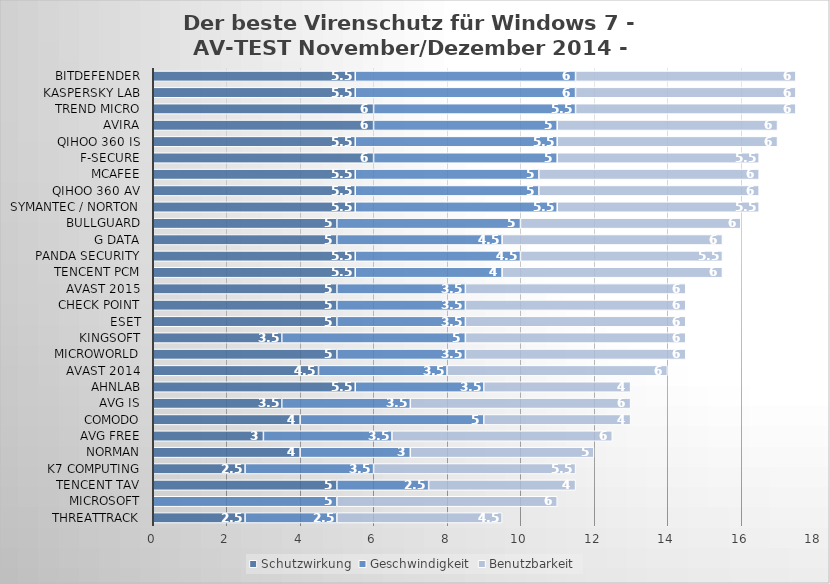
| Category | Schutzwirkung | Geschwindigkeit | Benutzbarkeit |
|---|---|---|---|
| ThreatTrack | 2.5 | 2.5 | 4.5 |
| Microsoft | 0 | 5 | 6 |
| Tencent TAV | 5 | 2.5 | 4 |
| K7 Computing | 2.5 | 3.5 | 5.5 |
| Norman | 4 | 3 | 5 |
| AVG Free | 3 | 3.5 | 6 |
| Comodo | 4 | 5 | 4 |
| AVG IS | 3.5 | 3.5 | 6 |
| AhnLab | 5.5 | 3.5 | 4 |
| Avast 2014 | 4.5 | 3.5 | 6 |
| Microworld | 5 | 3.5 | 6 |
| Kingsoft | 3.5 | 5 | 6 |
| ESET | 5 | 3.5 | 6 |
| Check Point | 5 | 3.5 | 6 |
| Avast 2015 | 5 | 3.5 | 6 |
| Tencent PCM | 5.5 | 4 | 6 |
| Panda Security | 5.5 | 4.5 | 5.5 |
| G Data | 5 | 4.5 | 6 |
| BullGuard | 5 | 5 | 6 |
| Symantec / Norton | 5.5 | 5.5 | 5.5 |
| Qihoo 360 AV | 5.5 | 5 | 6 |
| McAfee | 5.5 | 5 | 6 |
| F-Secure | 6 | 5 | 5.5 |
| Qihoo 360 IS | 5.5 | 5.5 | 6 |
| Avira | 6 | 5 | 6 |
| Trend Micro | 6 | 5.5 | 6 |
| Kaspersky Lab | 5.5 | 6 | 6 |
| Bitdefender | 5.5 | 6 | 6 |